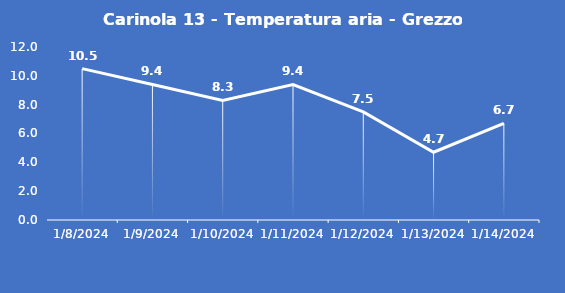
| Category | Carinola 13 - Temperatura aria - Grezzo (°C) |
|---|---|
| 1/8/24 | 10.5 |
| 1/9/24 | 9.4 |
| 1/10/24 | 8.3 |
| 1/11/24 | 9.4 |
| 1/12/24 | 7.5 |
| 1/13/24 | 4.7 |
| 1/14/24 | 6.7 |